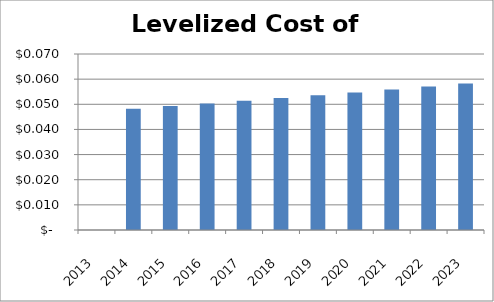
| Category | Levelized Cost of Energy |
|---|---|
| 2013.0 | 0 |
| 2014.0 | 0.048 |
| 2015.0 | 0.049 |
| 2016.0 | 0.05 |
| 2017.0 | 0.051 |
| 2018.0 | 0.052 |
| 2019.0 | 0.054 |
| 2020.0 | 0.055 |
| 2021.0 | 0.056 |
| 2022.0 | 0.057 |
| 2023.0 | 0.058 |